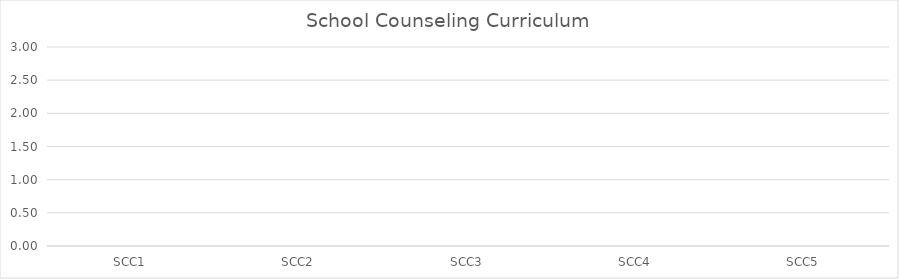
| Category | Series 0 |
|---|---|
| SCC1 | 0 |
| SCC2 | 0 |
| SCC3 | 0 |
| SCC4 | 0 |
| SCC5 | 0 |